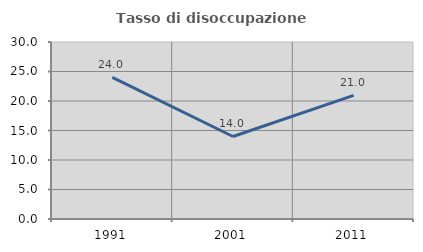
| Category | Tasso di disoccupazione giovanile  |
|---|---|
| 1991.0 | 24.019 |
| 2001.0 | 13.987 |
| 2011.0 | 20.95 |